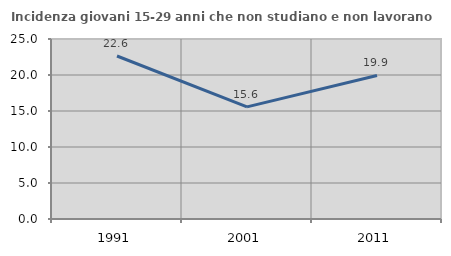
| Category | Incidenza giovani 15-29 anni che non studiano e non lavorano  |
|---|---|
| 1991.0 | 22.638 |
| 2001.0 | 15.568 |
| 2011.0 | 19.94 |